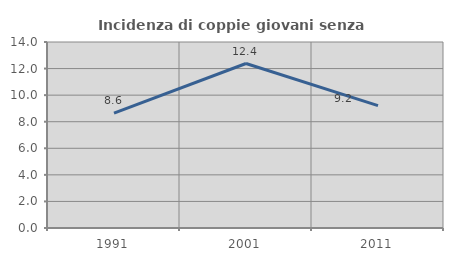
| Category | Incidenza di coppie giovani senza figli |
|---|---|
| 1991.0 | 8.642 |
| 2001.0 | 12.381 |
| 2011.0 | 9.208 |